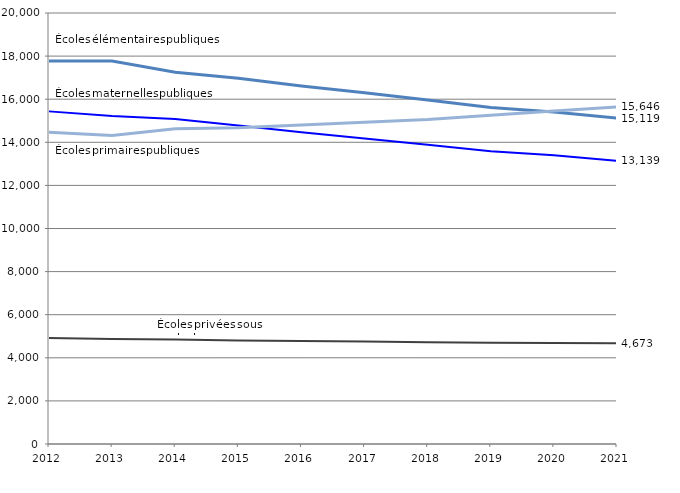
| Category | Écoles maternelles publiques | Privé sous contrat | Écoles élémentaires publiques | Écoles primaires publiques |
|---|---|---|---|---|
| 2012.0 | 15435 | 4914 | 17775 | 14462 |
| 2013.0 | 15215 | 4875 | 17772 | 14319 |
| 2014.0 | 15079 | 4846 | 17252 | 14631 |
| 2015.0 | 14784 | 4808 | 16973 | 14678 |
| 2016.0 | 14462 | 4775 | 16608 | 14807 |
| 2017.0 | 14179 | 4757 | 16295 | 14927 |
| 2018.0 | 13881 | 4719 | 15966 | 15055 |
| 2019.0 | 13583 | 4697 | 15618 | 15254 |
| 2020.0 | 13399 | 4687 | 15411 | 15452 |
| 2021.0 | 13139 | 4673 | 15119 | 15646 |